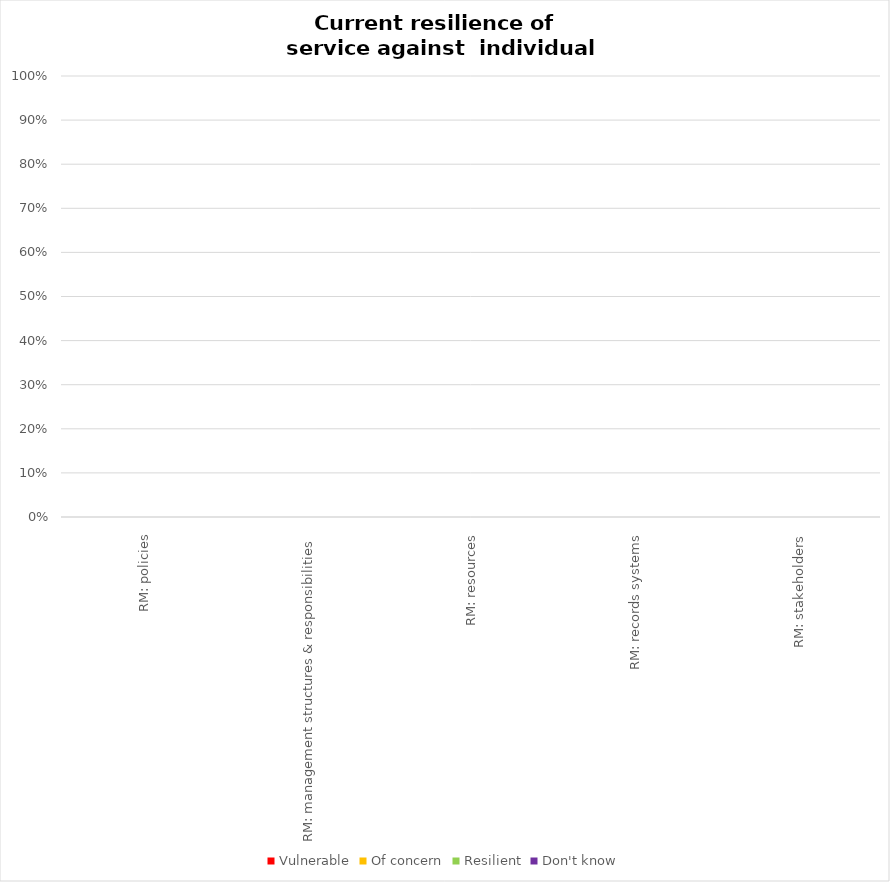
| Category | Vulnerable | Of concern | Resilient | Don't know |
|---|---|---|---|---|
| RM: policies | 0 | 0 | 0 | 0 |
| RM: management structures & responsibilities | 0 | 0 | 0 | 0 |
| RM: resources | 0 | 0 | 0 | 0 |
| RM: records systems | 0 | 0 | 0 | 0 |
| RM: stakeholders | 0 | 0 | 0 | 0 |